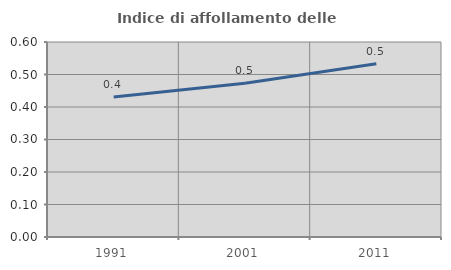
| Category | Indice di affollamento delle abitazioni  |
|---|---|
| 1991.0 | 0.431 |
| 2001.0 | 0.473 |
| 2011.0 | 0.533 |